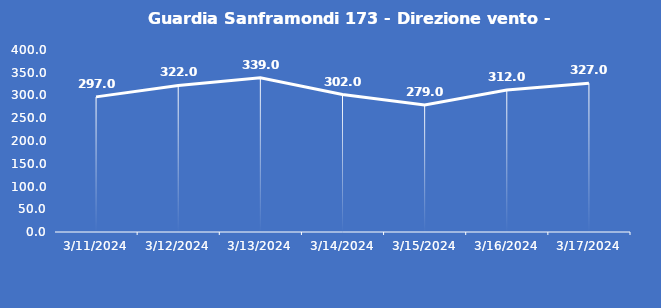
| Category | Guardia Sanframondi 173 - Direzione vento - Grezzo (°N) |
|---|---|
| 3/11/24 | 297 |
| 3/12/24 | 322 |
| 3/13/24 | 339 |
| 3/14/24 | 302 |
| 3/15/24 | 279 |
| 3/16/24 | 312 |
| 3/17/24 | 327 |